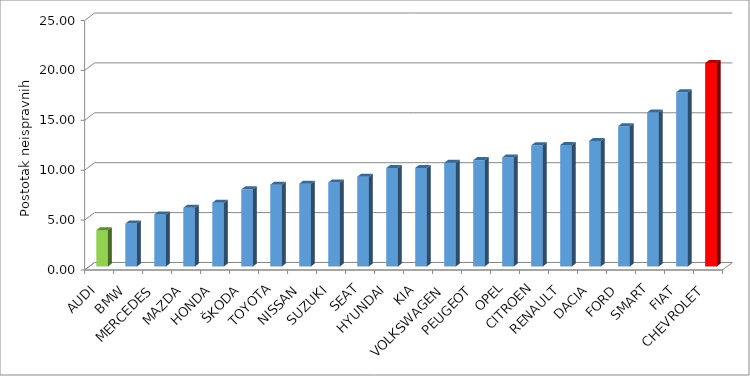
| Category | Series 4 |
|---|---|
| AUDI | 3.638 |
| BMW | 4.307 |
| MERCEDES | 5.22 |
| MAZDA | 5.885 |
| HONDA | 6.391 |
| ŠKODA | 7.729 |
| TOYOTA | 8.199 |
| NISSAN | 8.299 |
| SUZUKI | 8.422 |
| SEAT | 8.996 |
| HYUNDAI | 9.868 |
| KIA | 9.882 |
| VOLKSWAGEN | 10.389 |
| PEUGEOT | 10.659 |
| OPEL | 10.928 |
| CITROEN | 12.139 |
| RENAULT | 12.175 |
| DACIA | 12.578 |
| FORD | 14.065 |
| SMART | 15.441 |
| FIAT | 17.469 |
| CHEVROLET | 20.383 |